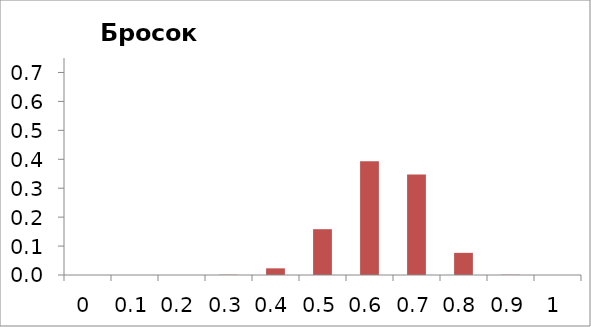
| Category | Series 1 |
|---|---|
| 0.0 | 0 |
| 0.1 | 0 |
| 0.2 | 0 |
| 0.3 | 0.001 |
| 0.4 | 0.023 |
| 0.5 | 0.158 |
| 0.6 | 0.393 |
| 0.7 | 0.347 |
| 0.8 | 0.077 |
| 0.9 | 0.001 |
| 1.0 | 0 |